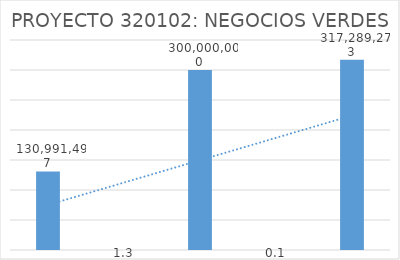
| Category | Series 0 |
|---|---|
| 0 | 130991497 |
| 1 | 1.29 |
| 2 | 300000000 |
| 3 | 0.058 |
| 4 | 317289273 |